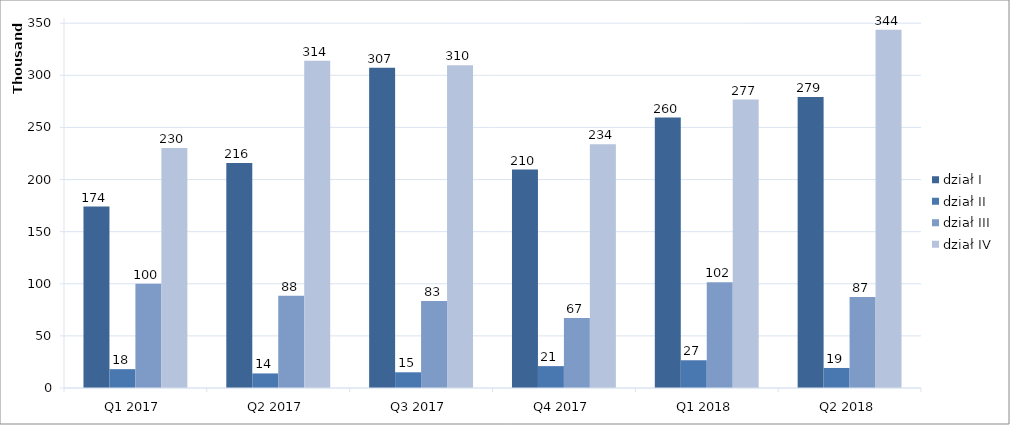
| Category | dział I | dział II | dział III | dział IV |
|---|---|---|---|---|
| Q1 2017 | 174063 | 18084 | 100050 | 230257 |
| Q2 2017 | 215960 | 13982 | 88480 | 314047 |
| Q3 2017 | 307369 | 15075 | 83469 | 309762 |
| Q4 2017 | 209620 | 20984 | 67212 | 233780 |
| Q1 2018 | 259500 | 26625 | 101511 | 276717 |
| Q2 2018 | 279164 | 19231 | 87259 | 343756 |